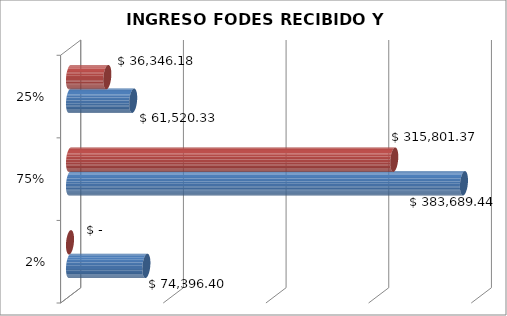
| Category | DISPONIBLE | EJECUTADO |
|---|---|---|
| 0.02 | 74396.4 | 0 |
| 0.75 | 383689.44 | 315801.37 |
| 0.25 | 61520.33 | 36346.18 |